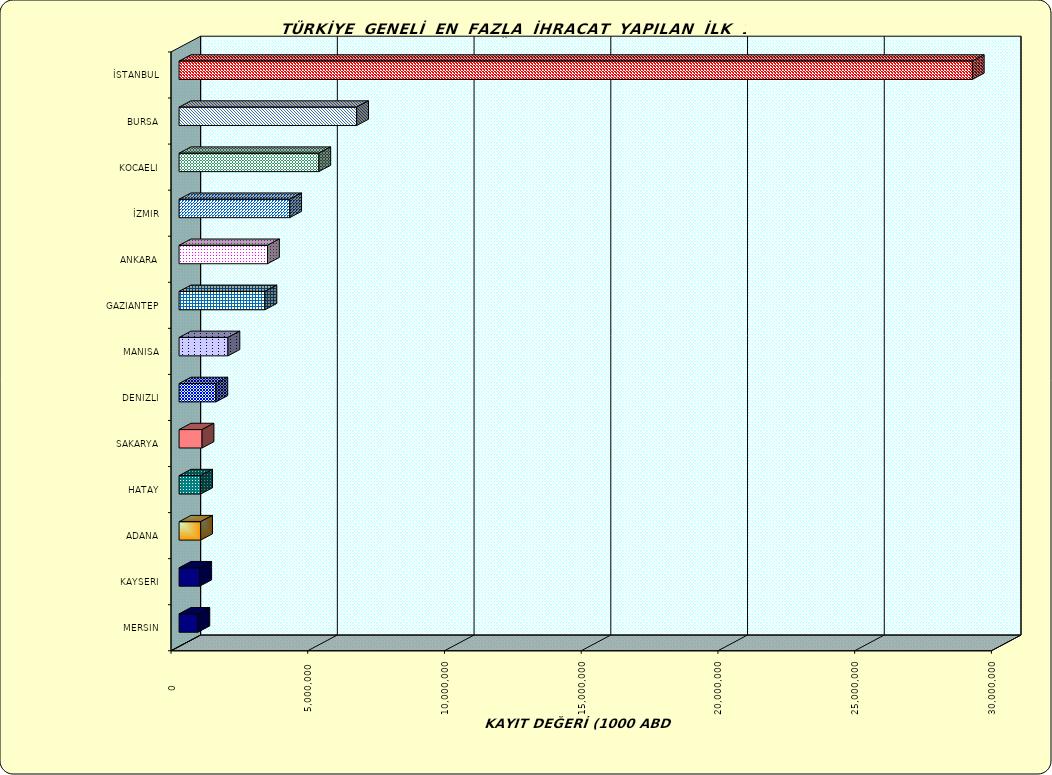
| Category | Series 0 |
|---|---|
| İSTANBUL | 29006105.307 |
| BURSA | 6493963.277 |
| KOCAELI | 5110555.642 |
| İZMIR | 4045325.103 |
| ANKARA | 3234042.001 |
| GAZIANTEP | 3140863.439 |
| MANISA | 1787473.56 |
| DENIZLI | 1345730.072 |
| SAKARYA | 840686.026 |
| HATAY | 789997.643 |
| ADANA | 789166.921 |
| KAYSERI | 756248.547 |
| MERSIN | 687989.458 |